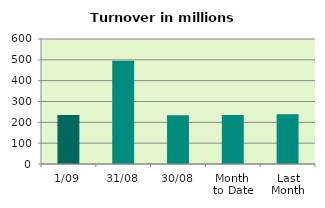
| Category | Series 0 |
|---|---|
| 1/09 | 235.708 |
| 31/08 | 495.506 |
| 30/08 | 234.497 |
| Month 
to Date | 235.708 |
| Last
Month | 239.159 |